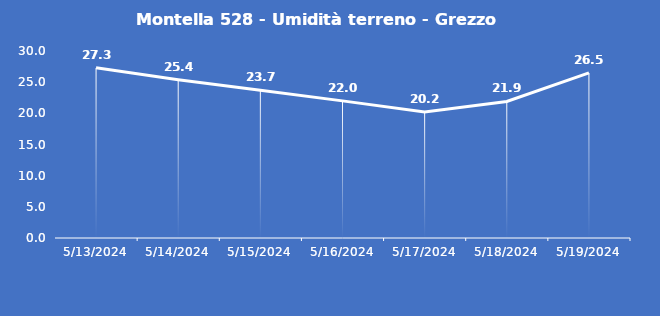
| Category | Montella 528 - Umidità terreno - Grezzo (%VWC) |
|---|---|
| 5/13/24 | 27.3 |
| 5/14/24 | 25.4 |
| 5/15/24 | 23.7 |
| 5/16/24 | 22 |
| 5/17/24 | 20.2 |
| 5/18/24 | 21.9 |
| 5/19/24 | 26.5 |